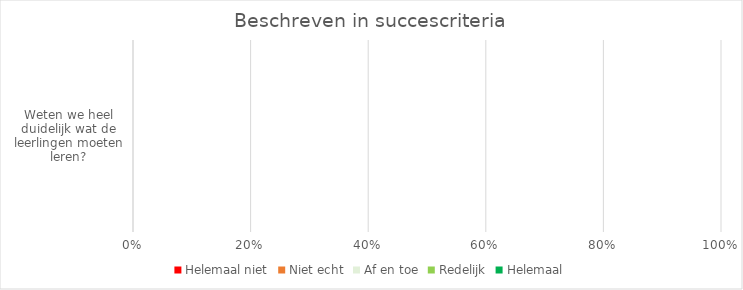
| Category | Helemaal niet | Niet echt | Af en toe | Redelijk | Helemaal |
|---|---|---|---|---|---|
| Weten we heel duidelijk wat de leerlingen moeten leren? | 0 | 0 | 0 | 0 | 0 |